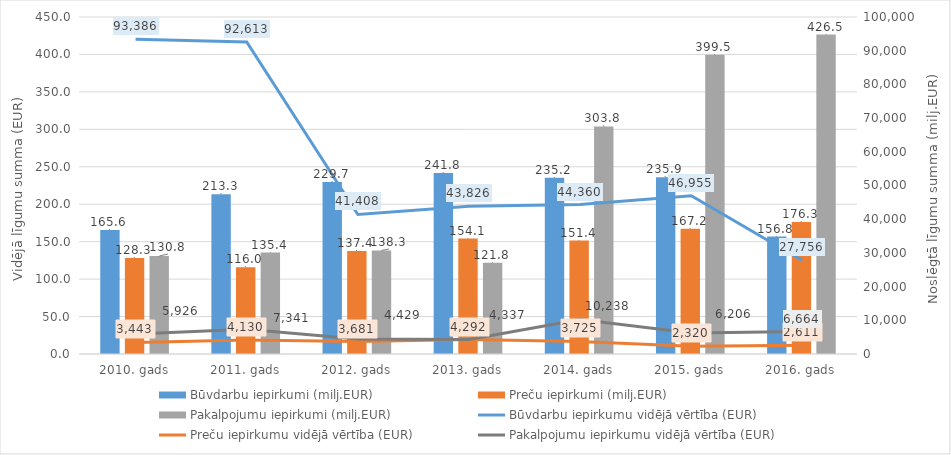
| Category | Būvdarbu iepirkumi (milj.EUR) | Preču iepirkumi (milj.EUR) | Pakalpojumu iepirkumi (milj.EUR) |
|---|---|---|---|
| 2010. gads | 165.6 | 128.3 | 130.8 |
| 2011. gads | 213.3 | 116 | 135.4 |
| 2012. gads | 229.7 | 137.4 | 138.3 |
| 2013. gads | 241.8 | 154.1 | 121.8 |
| 2014. gads | 235.2 | 151.4 | 303.8 |
| 2015. gads | 235.9 | 167.2 | 399.5 |
| 2016. gads | 156.8 | 176.3 | 426.5 |